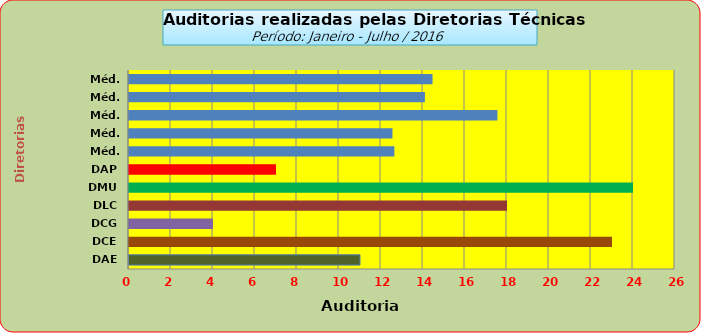
| Category | Series 0 |
|---|---|
| DAE | 11 |
| DCE | 23 |
| DCG | 4 |
| DLC | 18 |
| DMU | 24 |
| DAP | 7 |
| Méd. 2011 | 12.636 |
| Méd. 2012 | 12.545 |
| Méd. 2013 | 17.545 |
| Méd. 2014 | 14.091 |
| Méd. 2014 | 14.455 |